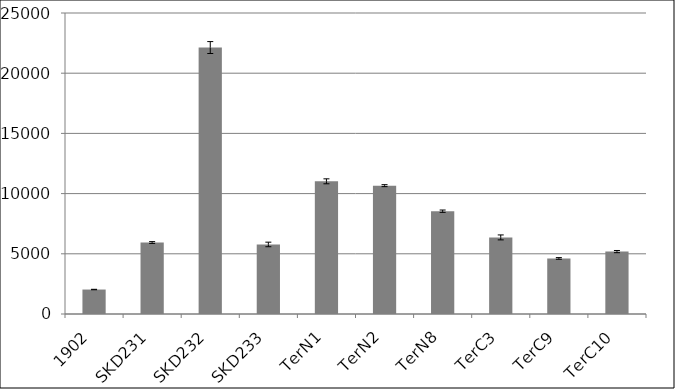
| Category | Series 0 |
|---|---|
| 1902 | 2031.888 |
| SKD231 | 5937.066 |
| SKD232 | 22130.678 |
| SKD233 | 5776.769 |
| TerN1 | 11020.121 |
| TerN2 | 10659.805 |
| TerN8 | 8539.065 |
| TerC3 | 6361.246 |
| TerC9 | 4615.277 |
| TerC10 | 5183.266 |